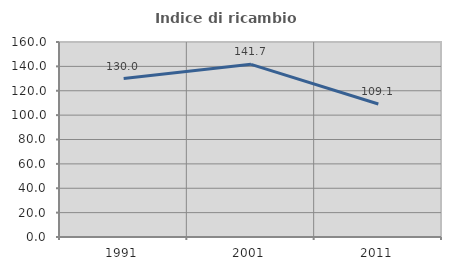
| Category | Indice di ricambio occupazionale  |
|---|---|
| 1991.0 | 130 |
| 2001.0 | 141.667 |
| 2011.0 | 109.091 |